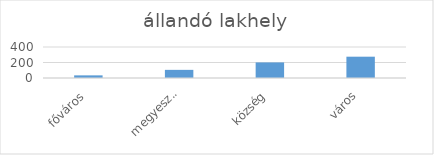
| Category | Series 0 |
|---|---|
| főváros | 34 |
| megyeszékhely | 105 |
| község | 201 |
| város | 275 |